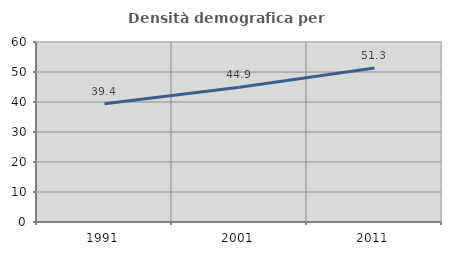
| Category | Densità demografica |
|---|---|
| 1991.0 | 39.386 |
| 2001.0 | 44.931 |
| 2011.0 | 51.312 |